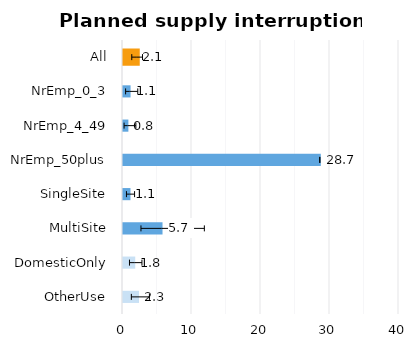
| Category | Series 0 |
|---|---|
| All | 2.051 |
| NrEmp_0_3 | 1.096 |
| NrEmp_4_49 | 0.779 |
| NrEmp_50plus | 28.666 |
| SingleSite | 1.083 |
| MultiSite | 5.728 |
| DomesticOnly | 1.77 |
| OtherUse | 2.321 |